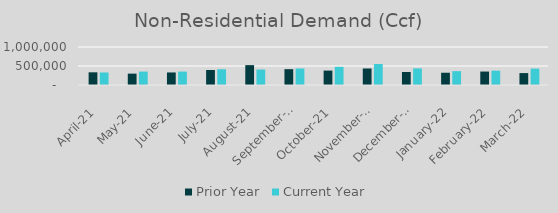
| Category | Prior Year | Current Year |
|---|---|---|
| 2021-04-01 | 333800.488 | 329084.722 |
| 2021-05-01 | 299245.56 | 353085 |
| 2021-06-01 | 330441.187 | 353141.442 |
| 2021-07-01 | 394304.316 | 414577.112 |
| 2021-08-01 | 522963.473 | 407774.995 |
| 2021-09-01 | 416886.629 | 434192.442 |
| 2021-10-01 | 379515 | 477878.526 |
| 2021-11-01 | 434815 | 552599.698 |
| 2021-12-01 | 342584.594 | 436956.784 |
| 2022-01-01 | 322657.16 | 364164.019 |
| 2022-02-01 | 354041 | 377149.369 |
| 2022-03-01 | 313343 | 432270.798 |